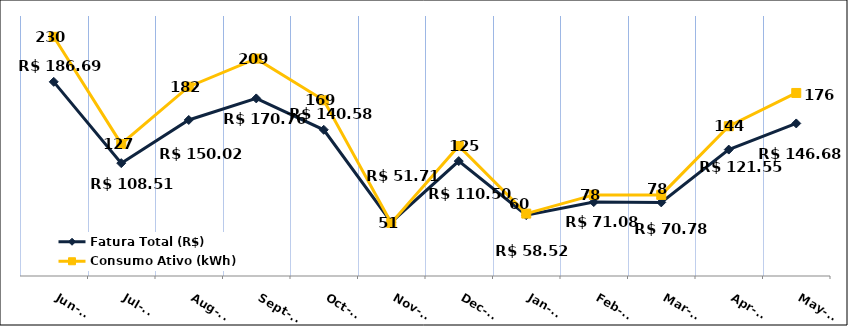
| Category | Fatura Total (R$) |
|---|---|
| 2023-06-01 | 186.69 |
| 2023-07-01 | 108.51 |
| 2023-08-01 | 150.02 |
| 2023-09-01 | 170.76 |
| 2023-10-01 | 140.58 |
| 2023-11-01 | 51.71 |
| 2023-12-01 | 110.5 |
| 2024-01-01 | 58.52 |
| 2024-02-01 | 71.08 |
| 2024-03-01 | 70.78 |
| 2024-04-01 | 121.55 |
| 2024-05-01 | 146.68 |